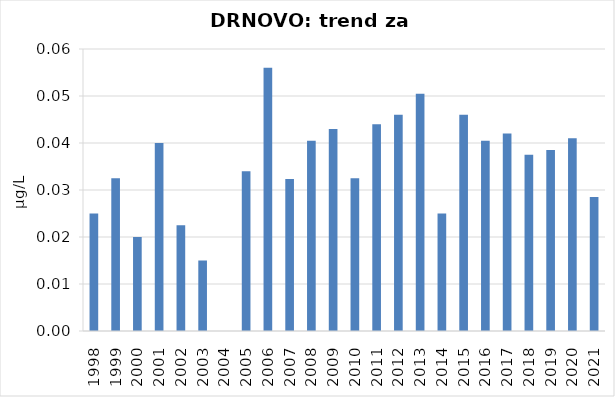
| Category | Vsota |
|---|---|
| 1998 | 0.025 |
| 1999 | 0.032 |
| 2000 | 0.02 |
| 2001 | 0.04 |
| 2002 | 0.022 |
| 2003 | 0.015 |
| 2004 | 0 |
| 2005 | 0.034 |
| 2006 | 0.056 |
| 2007 | 0.032 |
| 2008 | 0.04 |
| 2009 | 0.043 |
| 2010 | 0.032 |
| 2011 | 0.044 |
| 2012 | 0.046 |
| 2013 | 0.05 |
| 2014 | 0.025 |
| 2015 | 0.046 |
| 2016 | 0.04 |
| 2017 | 0.042 |
| 2018 | 0.038 |
| 2019 | 0.038 |
| 2020 | 0.041 |
| 2021 | 0.028 |